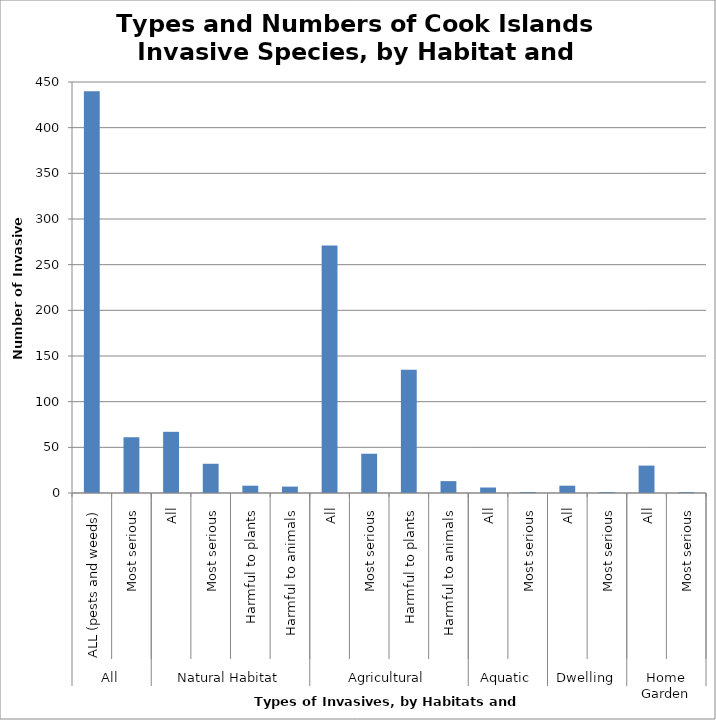
| Category | Series 0 |
|---|---|
| 0 | 440 |
| 1 | 61 |
| 2 | 67 |
| 3 | 32 |
| 4 | 8 |
| 5 | 7 |
| 6 | 271 |
| 7 | 43 |
| 8 | 135 |
| 9 | 13 |
| 10 | 6 |
| 11 | 1 |
| 12 | 8 |
| 13 | 1 |
| 14 | 30 |
| 15 | 1 |